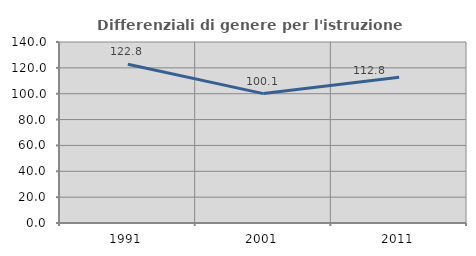
| Category | Differenziali di genere per l'istruzione superiore |
|---|---|
| 1991.0 | 122.84 |
| 2001.0 | 100.092 |
| 2011.0 | 112.819 |